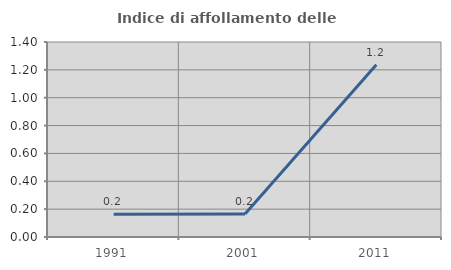
| Category | Indice di affollamento delle abitazioni  |
|---|---|
| 1991.0 | 0.164 |
| 2001.0 | 0.166 |
| 2011.0 | 1.237 |